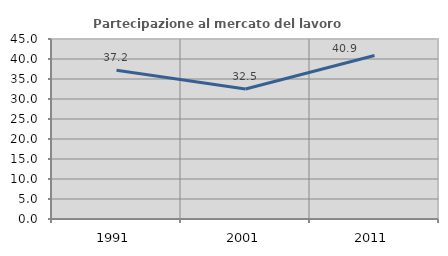
| Category | Partecipazione al mercato del lavoro  femminile |
|---|---|
| 1991.0 | 37.177 |
| 2001.0 | 32.505 |
| 2011.0 | 40.857 |